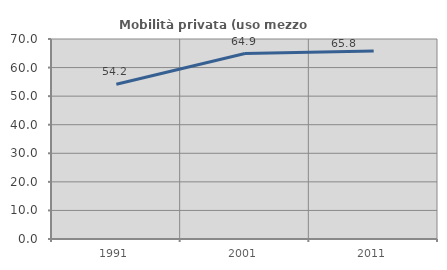
| Category | Mobilità privata (uso mezzo privato) |
|---|---|
| 1991.0 | 54.162 |
| 2001.0 | 64.91 |
| 2011.0 | 65.827 |